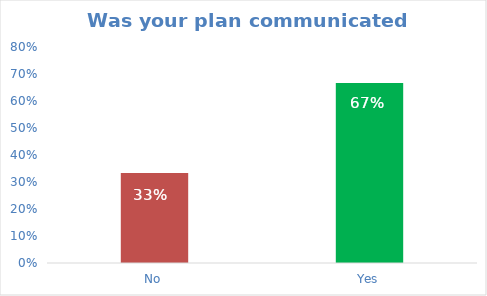
| Category | Series 0 |
|---|---|
| No | 0.333 |
| Yes | 0.667 |